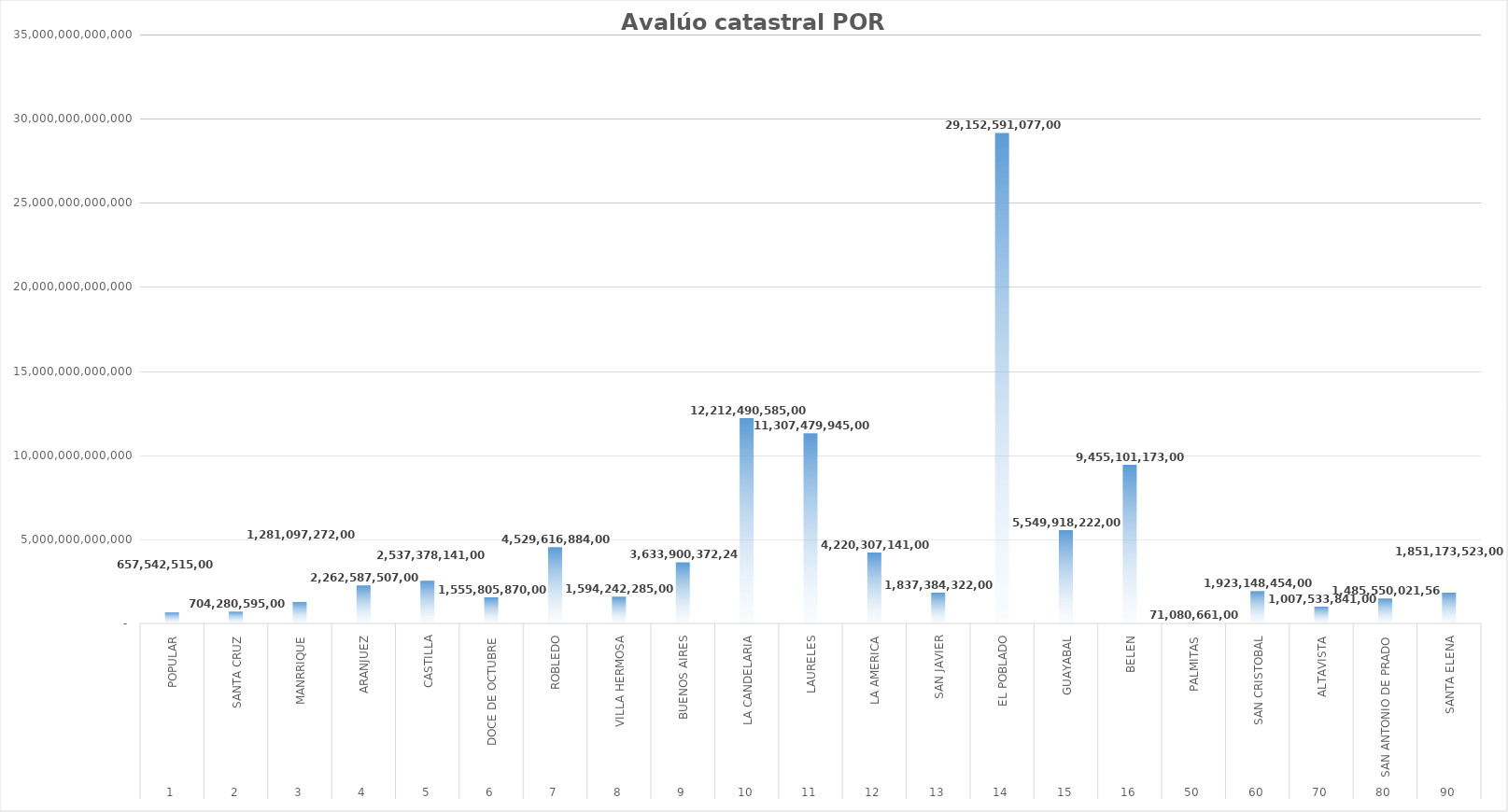
| Category | Avalúo Total |
|---|---|
| 0 | 657542515000 |
| 1 | 704280595000 |
| 2 | 1281097272000 |
| 3 | 2262587507000 |
| 4 | 2537378141000 |
| 5 | 1555805870000 |
| 6 | 4529616884000 |
| 7 | 1594242285000 |
| 8 | 3633900372240 |
| 9 | 12212490585000 |
| 10 | 11307479945000 |
| 11 | 4220307141000 |
| 12 | 1837384322000 |
| 13 | 29152591077000 |
| 14 | 5549918222000 |
| 15 | 9455101173000 |
| 16 | 71080661000 |
| 17 | 1923148454000 |
| 18 | 1007533841000 |
| 19 | 1485550021568 |
| 20 | 1851173523000 |